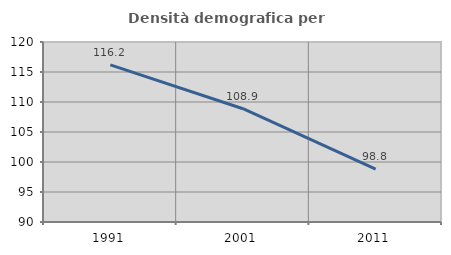
| Category | Densità demografica |
|---|---|
| 1991.0 | 116.19 |
| 2001.0 | 108.878 |
| 2011.0 | 98.825 |